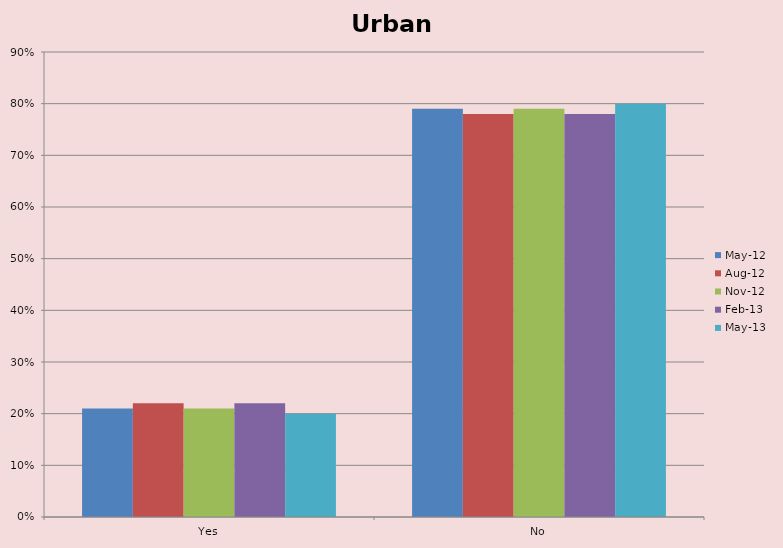
| Category | May-12 | Aug-12 | Nov-12 | Feb-13 | May-13 |
|---|---|---|---|---|---|
| Yes | 0.21 | 0.22 | 0.21 | 0.22 | 0.2 |
| No | 0.79 | 0.78 | 0.79 | 0.78 | 0.8 |